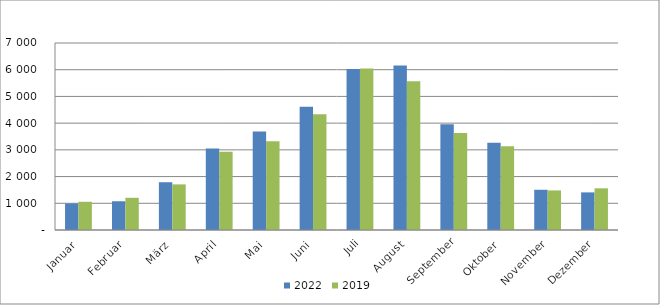
| Category | 2022 | 2019 |
|---|---|---|
| Januar | 992481 | 1056116 |
| Februar | 1076602 | 1205647 |
| März | 1788424 | 1707674 |
| April | 3046727 | 2926173 |
| Mai | 3686767 | 3318785 |
| Juni | 4613406 | 4335688 |
| Juli | 6027469 | 6044743 |
| August | 6153206 | 5567222 |
| September | 3962128 | 3633060 |
| Oktober | 3269839 | 3138683 |
| November | 1505721 | 1480784 |
| Dezember | 1408039 | 1560219 |